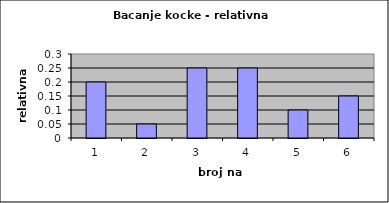
| Category | Series 0 |
|---|---|
| 0 | 0.2 |
| 1 | 0.05 |
| 2 | 0.25 |
| 3 | 0.25 |
| 4 | 0.1 |
| 5 | 0.15 |